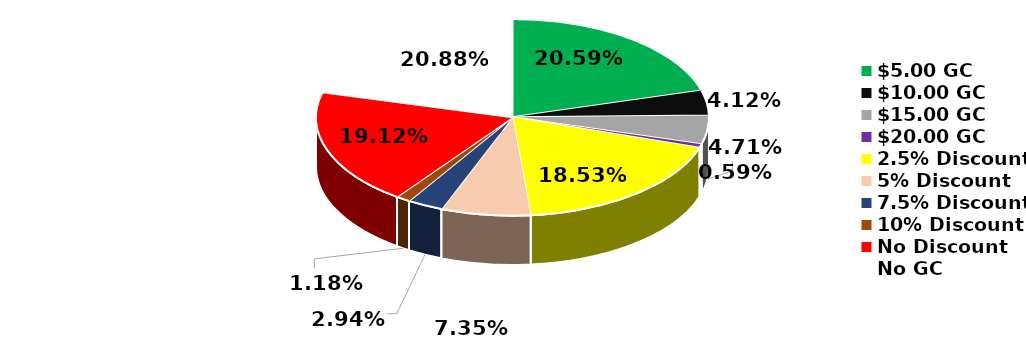
| Category | Series 0 |
|---|---|
| $5.00 GC | 0.206 |
| $10.00 GC | 0.041 |
| $15.00 GC | 0.047 |
| $20.00 GC | 0.006 |
| 2.5% Discount | 0.185 |
| 5% Discount | 0.074 |
| 7.5% Discount | 0.029 |
| 10% Discount | 0.012 |
| No Discount | 0.191 |
| No GC | 0.209 |